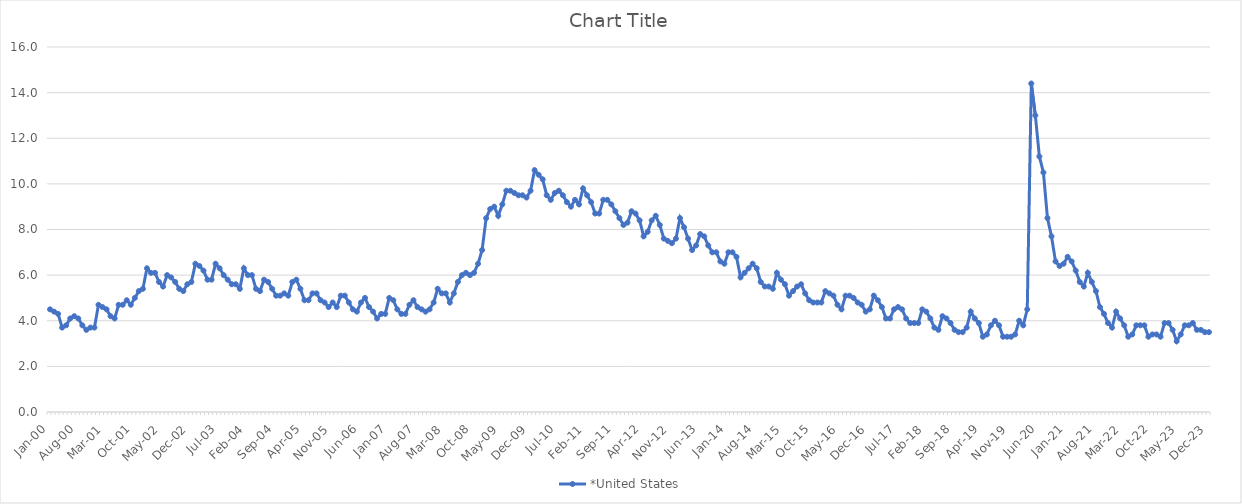
| Category | *United States | Alaska | Alabama | Arkansas | Arizona | California | Colorado | Connecticut | Delaware | Florida | Georgia | Hawaii | Iowa | Idaho | Illinois | Indiana | Kansas | Kentucky | Louisiana | Massachusetts | Maryland | Maine | Michigan | Minnesota | Missouri | Mississippi | Montana | North Carolina | North Dakota | Nebraska | New Hampshire | New Jersey | New Mexico | Nevada | New York | Ohio | Oklahoma | Oregon | Pennsylvania | Rhode Island | South Carolina | South Dakota | Tennessee | Texas | Utah | Virginia | Vermont | Washington | Wisconsin | West Virginia | Wyoming |
|---|---|---|---|---|---|---|---|---|---|---|---|---|---|---|---|---|---|---|---|---|---|---|---|---|---|---|---|---|---|---|---|---|---|---|---|---|---|---|---|---|---|---|---|---|---|---|---|---|---|---|---|
| Jan-00 | 4.5 |  |  |  |  |  |  |  |  |  |  |  |  |  |  |  |  |  |  |  |  |  |  |  |  |  |  |  |  |  |  |  |  |  |  |  |  |  |  |  |  |  |  |  |  |  |  |  |  |  |  |
| Feb-00 | 4.4 |  |  |  |  |  |  |  |  |  |  |  |  |  |  |  |  |  |  |  |  |  |  |  |  |  |  |  |  |  |  |  |  |  |  |  |  |  |  |  |  |  |  |  |  |  |  |  |  |  |  |
| Mar-00 | 4.3 |  |  |  |  |  |  |  |  |  |  |  |  |  |  |  |  |  |  |  |  |  |  |  |  |  |  |  |  |  |  |  |  |  |  |  |  |  |  |  |  |  |  |  |  |  |  |  |  |  |  |
| Apr-00 | 3.7 |  |  |  |  |  |  |  |  |  |  |  |  |  |  |  |  |  |  |  |  |  |  |  |  |  |  |  |  |  |  |  |  |  |  |  |  |  |  |  |  |  |  |  |  |  |  |  |  |  |  |
| May-00 | 3.8 |  |  |  |  |  |  |  |  |  |  |  |  |  |  |  |  |  |  |  |  |  |  |  |  |  |  |  |  |  |  |  |  |  |  |  |  |  |  |  |  |  |  |  |  |  |  |  |  |  |  |
| Jun-00 | 4.1 |  |  |  |  |  |  |  |  |  |  |  |  |  |  |  |  |  |  |  |  |  |  |  |  |  |  |  |  |  |  |  |  |  |  |  |  |  |  |  |  |  |  |  |  |  |  |  |  |  |  |
| Jul-00 | 4.2 |  |  |  |  |  |  |  |  |  |  |  |  |  |  |  |  |  |  |  |  |  |  |  |  |  |  |  |  |  |  |  |  |  |  |  |  |  |  |  |  |  |  |  |  |  |  |  |  |  |  |
| Aug-00 | 4.1 |  |  |  |  |  |  |  |  |  |  |  |  |  |  |  |  |  |  |  |  |  |  |  |  |  |  |  |  |  |  |  |  |  |  |  |  |  |  |  |  |  |  |  |  |  |  |  |  |  |  |
| Sep-00 | 3.8 |  |  |  |  |  |  |  |  |  |  |  |  |  |  |  |  |  |  |  |  |  |  |  |  |  |  |  |  |  |  |  |  |  |  |  |  |  |  |  |  |  |  |  |  |  |  |  |  |  |  |
| Oct-00 | 3.6 |  |  |  |  |  |  |  |  |  |  |  |  |  |  |  |  |  |  |  |  |  |  |  |  |  |  |  |  |  |  |  |  |  |  |  |  |  |  |  |  |  |  |  |  |  |  |  |  |  |  |
| Nov-00 | 3.7 |  |  |  |  |  |  |  |  |  |  |  |  |  |  |  |  |  |  |  |  |  |  |  |  |  |  |  |  |  |  |  |  |  |  |  |  |  |  |  |  |  |  |  |  |  |  |  |  |  |  |
| Dec-00 | 3.7 |  |  |  |  |  |  |  |  |  |  |  |  |  |  |  |  |  |  |  |  |  |  |  |  |  |  |  |  |  |  |  |  |  |  |  |  |  |  |  |  |  |  |  |  |  |  |  |  |  |  |
| Jan-01 | 4.7 |  |  |  |  |  |  |  |  |  |  |  |  |  |  |  |  |  |  |  |  |  |  |  |  |  |  |  |  |  |  |  |  |  |  |  |  |  |  |  |  |  |  |  |  |  |  |  |  |  |  |
| Feb-01 | 4.6 |  |  |  |  |  |  |  |  |  |  |  |  |  |  |  |  |  |  |  |  |  |  |  |  |  |  |  |  |  |  |  |  |  |  |  |  |  |  |  |  |  |  |  |  |  |  |  |  |  |  |
| Mar-01 | 4.5 |  |  |  |  |  |  |  |  |  |  |  |  |  |  |  |  |  |  |  |  |  |  |  |  |  |  |  |  |  |  |  |  |  |  |  |  |  |  |  |  |  |  |  |  |  |  |  |  |  |  |
| Apr-01 | 4.2 |  |  |  |  |  |  |  |  |  |  |  |  |  |  |  |  |  |  |  |  |  |  |  |  |  |  |  |  |  |  |  |  |  |  |  |  |  |  |  |  |  |  |  |  |  |  |  |  |  |  |
| May-01 | 4.1 |  |  |  |  |  |  |  |  |  |  |  |  |  |  |  |  |  |  |  |  |  |  |  |  |  |  |  |  |  |  |  |  |  |  |  |  |  |  |  |  |  |  |  |  |  |  |  |  |  |  |
| Jun-01 | 4.7 |  |  |  |  |  |  |  |  |  |  |  |  |  |  |  |  |  |  |  |  |  |  |  |  |  |  |  |  |  |  |  |  |  |  |  |  |  |  |  |  |  |  |  |  |  |  |  |  |  |  |
| Jul-01 | 4.7 |  |  |  |  |  |  |  |  |  |  |  |  |  |  |  |  |  |  |  |  |  |  |  |  |  |  |  |  |  |  |  |  |  |  |  |  |  |  |  |  |  |  |  |  |  |  |  |  |  |  |
| Aug-01 | 4.9 |  |  |  |  |  |  |  |  |  |  |  |  |  |  |  |  |  |  |  |  |  |  |  |  |  |  |  |  |  |  |  |  |  |  |  |  |  |  |  |  |  |  |  |  |  |  |  |  |  |  |
| Sep-01 | 4.7 |  |  |  |  |  |  |  |  |  |  |  |  |  |  |  |  |  |  |  |  |  |  |  |  |  |  |  |  |  |  |  |  |  |  |  |  |  |  |  |  |  |  |  |  |  |  |  |  |  |  |
| Oct-01 | 5 |  |  |  |  |  |  |  |  |  |  |  |  |  |  |  |  |  |  |  |  |  |  |  |  |  |  |  |  |  |  |  |  |  |  |  |  |  |  |  |  |  |  |  |  |  |  |  |  |  |  |
| Nov-01 | 5.3 |  |  |  |  |  |  |  |  |  |  |  |  |  |  |  |  |  |  |  |  |  |  |  |  |  |  |  |  |  |  |  |  |  |  |  |  |  |  |  |  |  |  |  |  |  |  |  |  |  |  |
| Dec-01 | 5.4 |  |  |  |  |  |  |  |  |  |  |  |  |  |  |  |  |  |  |  |  |  |  |  |  |  |  |  |  |  |  |  |  |  |  |  |  |  |  |  |  |  |  |  |  |  |  |  |  |  |  |
| Jan-02 | 6.3 |  |  |  |  |  |  |  |  |  |  |  |  |  |  |  |  |  |  |  |  |  |  |  |  |  |  |  |  |  |  |  |  |  |  |  |  |  |  |  |  |  |  |  |  |  |  |  |  |  |  |
| Feb-02 | 6.1 |  |  |  |  |  |  |  |  |  |  |  |  |  |  |  |  |  |  |  |  |  |  |  |  |  |  |  |  |  |  |  |  |  |  |  |  |  |  |  |  |  |  |  |  |  |  |  |  |  |  |
| Mar-02 | 6.1 |  |  |  |  |  |  |  |  |  |  |  |  |  |  |  |  |  |  |  |  |  |  |  |  |  |  |  |  |  |  |  |  |  |  |  |  |  |  |  |  |  |  |  |  |  |  |  |  |  |  |
| Apr-02 | 5.7 |  |  |  |  |  |  |  |  |  |  |  |  |  |  |  |  |  |  |  |  |  |  |  |  |  |  |  |  |  |  |  |  |  |  |  |  |  |  |  |  |  |  |  |  |  |  |  |  |  |  |
| May-02 | 5.5 |  |  |  |  |  |  |  |  |  |  |  |  |  |  |  |  |  |  |  |  |  |  |  |  |  |  |  |  |  |  |  |  |  |  |  |  |  |  |  |  |  |  |  |  |  |  |  |  |  |  |
| Jun-02 | 6 |  |  |  |  |  |  |  |  |  |  |  |  |  |  |  |  |  |  |  |  |  |  |  |  |  |  |  |  |  |  |  |  |  |  |  |  |  |  |  |  |  |  |  |  |  |  |  |  |  |  |
| Jul-02 | 5.9 |  |  |  |  |  |  |  |  |  |  |  |  |  |  |  |  |  |  |  |  |  |  |  |  |  |  |  |  |  |  |  |  |  |  |  |  |  |  |  |  |  |  |  |  |  |  |  |  |  |  |
| Aug-02 | 5.7 |  |  |  |  |  |  |  |  |  |  |  |  |  |  |  |  |  |  |  |  |  |  |  |  |  |  |  |  |  |  |  |  |  |  |  |  |  |  |  |  |  |  |  |  |  |  |  |  |  |  |
| Sep-02 | 5.4 |  |  |  |  |  |  |  |  |  |  |  |  |  |  |  |  |  |  |  |  |  |  |  |  |  |  |  |  |  |  |  |  |  |  |  |  |  |  |  |  |  |  |  |  |  |  |  |  |  |  |
| Oct-02 | 5.3 |  |  |  |  |  |  |  |  |  |  |  |  |  |  |  |  |  |  |  |  |  |  |  |  |  |  |  |  |  |  |  |  |  |  |  |  |  |  |  |  |  |  |  |  |  |  |  |  |  |  |
| Nov-02 | 5.6 |  |  |  |  |  |  |  |  |  |  |  |  |  |  |  |  |  |  |  |  |  |  |  |  |  |  |  |  |  |  |  |  |  |  |  |  |  |  |  |  |  |  |  |  |  |  |  |  |  |  |
| Dec-02 | 5.7 |  |  |  |  |  |  |  |  |  |  |  |  |  |  |  |  |  |  |  |  |  |  |  |  |  |  |  |  |  |  |  |  |  |  |  |  |  |  |  |  |  |  |  |  |  |  |  |  |  |  |
| Jan-03 | 6.5 |  |  |  |  |  |  |  |  |  |  |  |  |  |  |  |  |  |  |  |  |  |  |  |  |  |  |  |  |  |  |  |  |  |  |  |  |  |  |  |  |  |  |  |  |  |  |  |  |  |  |
| Feb-03 | 6.4 |  |  |  |  |  |  |  |  |  |  |  |  |  |  |  |  |  |  |  |  |  |  |  |  |  |  |  |  |  |  |  |  |  |  |  |  |  |  |  |  |  |  |  |  |  |  |  |  |  |  |
| Mar-03 | 6.2 |  |  |  |  |  |  |  |  |  |  |  |  |  |  |  |  |  |  |  |  |  |  |  |  |  |  |  |  |  |  |  |  |  |  |  |  |  |  |  |  |  |  |  |  |  |  |  |  |  |  |
| Apr-03 | 5.8 |  |  |  |  |  |  |  |  |  |  |  |  |  |  |  |  |  |  |  |  |  |  |  |  |  |  |  |  |  |  |  |  |  |  |  |  |  |  |  |  |  |  |  |  |  |  |  |  |  |  |
| May-03 | 5.8 |  |  |  |  |  |  |  |  |  |  |  |  |  |  |  |  |  |  |  |  |  |  |  |  |  |  |  |  |  |  |  |  |  |  |  |  |  |  |  |  |  |  |  |  |  |  |  |  |  |  |
| Jun-03 | 6.5 |  |  |  |  |  |  |  |  |  |  |  |  |  |  |  |  |  |  |  |  |  |  |  |  |  |  |  |  |  |  |  |  |  |  |  |  |  |  |  |  |  |  |  |  |  |  |  |  |  |  |
| Jul-03 | 6.3 |  |  |  |  |  |  |  |  |  |  |  |  |  |  |  |  |  |  |  |  |  |  |  |  |  |  |  |  |  |  |  |  |  |  |  |  |  |  |  |  |  |  |  |  |  |  |  |  |  |  |
| Aug-03 | 6 |  |  |  |  |  |  |  |  |  |  |  |  |  |  |  |  |  |  |  |  |  |  |  |  |  |  |  |  |  |  |  |  |  |  |  |  |  |  |  |  |  |  |  |  |  |  |  |  |  |  |
| Sep-03 | 5.8 |  |  |  |  |  |  |  |  |  |  |  |  |  |  |  |  |  |  |  |  |  |  |  |  |  |  |  |  |  |  |  |  |  |  |  |  |  |  |  |  |  |  |  |  |  |  |  |  |  |  |
| Oct-03 | 5.6 |  |  |  |  |  |  |  |  |  |  |  |  |  |  |  |  |  |  |  |  |  |  |  |  |  |  |  |  |  |  |  |  |  |  |  |  |  |  |  |  |  |  |  |  |  |  |  |  |  |  |
| Nov-03 | 5.6 |  |  |  |  |  |  |  |  |  |  |  |  |  |  |  |  |  |  |  |  |  |  |  |  |  |  |  |  |  |  |  |  |  |  |  |  |  |  |  |  |  |  |  |  |  |  |  |  |  |  |
| Dec-03 | 5.4 |  |  |  |  |  |  |  |  |  |  |  |  |  |  |  |  |  |  |  |  |  |  |  |  |  |  |  |  |  |  |  |  |  |  |  |  |  |  |  |  |  |  |  |  |  |  |  |  |  |  |
| Jan-04 | 6.3 |  |  |  |  |  |  |  |  |  |  |  |  |  |  |  |  |  |  |  |  |  |  |  |  |  |  |  |  |  |  |  |  |  |  |  |  |  |  |  |  |  |  |  |  |  |  |  |  |  |  |
| Feb-04 | 6 |  |  |  |  |  |  |  |  |  |  |  |  |  |  |  |  |  |  |  |  |  |  |  |  |  |  |  |  |  |  |  |  |  |  |  |  |  |  |  |  |  |  |  |  |  |  |  |  |  |  |
| Mar-04 | 6 |  |  |  |  |  |  |  |  |  |  |  |  |  |  |  |  |  |  |  |  |  |  |  |  |  |  |  |  |  |  |  |  |  |  |  |  |  |  |  |  |  |  |  |  |  |  |  |  |  |  |
| Apr-04 | 5.4 |  |  |  |  |  |  |  |  |  |  |  |  |  |  |  |  |  |  |  |  |  |  |  |  |  |  |  |  |  |  |  |  |  |  |  |  |  |  |  |  |  |  |  |  |  |  |  |  |  |  |
| May-04 | 5.3 |  |  |  |  |  |  |  |  |  |  |  |  |  |  |  |  |  |  |  |  |  |  |  |  |  |  |  |  |  |  |  |  |  |  |  |  |  |  |  |  |  |  |  |  |  |  |  |  |  |  |
| Jun-04 | 5.8 |  |  |  |  |  |  |  |  |  |  |  |  |  |  |  |  |  |  |  |  |  |  |  |  |  |  |  |  |  |  |  |  |  |  |  |  |  |  |  |  |  |  |  |  |  |  |  |  |  |  |
| Jul-04 | 5.7 |  |  |  |  |  |  |  |  |  |  |  |  |  |  |  |  |  |  |  |  |  |  |  |  |  |  |  |  |  |  |  |  |  |  |  |  |  |  |  |  |  |  |  |  |  |  |  |  |  |  |
| Aug-04 | 5.4 |  |  |  |  |  |  |  |  |  |  |  |  |  |  |  |  |  |  |  |  |  |  |  |  |  |  |  |  |  |  |  |  |  |  |  |  |  |  |  |  |  |  |  |  |  |  |  |  |  |  |
| Sep-04 | 5.1 |  |  |  |  |  |  |  |  |  |  |  |  |  |  |  |  |  |  |  |  |  |  |  |  |  |  |  |  |  |  |  |  |  |  |  |  |  |  |  |  |  |  |  |  |  |  |  |  |  |  |
| Oct-04 | 5.1 |  |  |  |  |  |  |  |  |  |  |  |  |  |  |  |  |  |  |  |  |  |  |  |  |  |  |  |  |  |  |  |  |  |  |  |  |  |  |  |  |  |  |  |  |  |  |  |  |  |  |
| Nov-04 | 5.2 |  |  |  |  |  |  |  |  |  |  |  |  |  |  |  |  |  |  |  |  |  |  |  |  |  |  |  |  |  |  |  |  |  |  |  |  |  |  |  |  |  |  |  |  |  |  |  |  |  |  |
| Dec-04 | 5.1 |  |  |  |  |  |  |  |  |  |  |  |  |  |  |  |  |  |  |  |  |  |  |  |  |  |  |  |  |  |  |  |  |  |  |  |  |  |  |  |  |  |  |  |  |  |  |  |  |  |  |
| Jan-05 | 5.7 |  |  |  |  |  |  |  |  |  |  |  |  |  |  |  |  |  |  |  |  |  |  |  |  |  |  |  |  |  |  |  |  |  |  |  |  |  |  |  |  |  |  |  |  |  |  |  |  |  |  |
| Feb-05 | 5.8 |  |  |  |  |  |  |  |  |  |  |  |  |  |  |  |  |  |  |  |  |  |  |  |  |  |  |  |  |  |  |  |  |  |  |  |  |  |  |  |  |  |  |  |  |  |  |  |  |  |  |
| Mar-05 | 5.4 |  |  |  |  |  |  |  |  |  |  |  |  |  |  |  |  |  |  |  |  |  |  |  |  |  |  |  |  |  |  |  |  |  |  |  |  |  |  |  |  |  |  |  |  |  |  |  |  |  |  |
| Apr-05 | 4.9 |  |  |  |  |  |  |  |  |  |  |  |  |  |  |  |  |  |  |  |  |  |  |  |  |  |  |  |  |  |  |  |  |  |  |  |  |  |  |  |  |  |  |  |  |  |  |  |  |  |  |
| May-05 | 4.9 |  |  |  |  |  |  |  |  |  |  |  |  |  |  |  |  |  |  |  |  |  |  |  |  |  |  |  |  |  |  |  |  |  |  |  |  |  |  |  |  |  |  |  |  |  |  |  |  |  |  |
| Jun-05 | 5.2 |  |  |  |  |  |  |  |  |  |  |  |  |  |  |  |  |  |  |  |  |  |  |  |  |  |  |  |  |  |  |  |  |  |  |  |  |  |  |  |  |  |  |  |  |  |  |  |  |  |  |
| Jul-05 | 5.2 |  |  |  |  |  |  |  |  |  |  |  |  |  |  |  |  |  |  |  |  |  |  |  |  |  |  |  |  |  |  |  |  |  |  |  |  |  |  |  |  |  |  |  |  |  |  |  |  |  |  |
| Aug-05 | 4.9 |  |  |  |  |  |  |  |  |  |  |  |  |  |  |  |  |  |  |  |  |  |  |  |  |  |  |  |  |  |  |  |  |  |  |  |  |  |  |  |  |  |  |  |  |  |  |  |  |  |  |
| Sep-05 | 4.8 |  |  |  |  |  |  |  |  |  |  |  |  |  |  |  |  |  |  |  |  |  |  |  |  |  |  |  |  |  |  |  |  |  |  |  |  |  |  |  |  |  |  |  |  |  |  |  |  |  |  |
| Oct-05 | 4.6 |  |  |  |  |  |  |  |  |  |  |  |  |  |  |  |  |  |  |  |  |  |  |  |  |  |  |  |  |  |  |  |  |  |  |  |  |  |  |  |  |  |  |  |  |  |  |  |  |  |  |
| Nov-05 | 4.8 |  |  |  |  |  |  |  |  |  |  |  |  |  |  |  |  |  |  |  |  |  |  |  |  |  |  |  |  |  |  |  |  |  |  |  |  |  |  |  |  |  |  |  |  |  |  |  |  |  |  |
| Dec-05 | 4.6 |  |  |  |  |  |  |  |  |  |  |  |  |  |  |  |  |  |  |  |  |  |  |  |  |  |  |  |  |  |  |  |  |  |  |  |  |  |  |  |  |  |  |  |  |  |  |  |  |  |  |
| Jan-06 | 5.1 |  |  |  |  |  |  |  |  |  |  |  |  |  |  |  |  |  |  |  |  |  |  |  |  |  |  |  |  |  |  |  |  |  |  |  |  |  |  |  |  |  |  |  |  |  |  |  |  |  |  |
| Feb-06 | 5.1 |  |  |  |  |  |  |  |  |  |  |  |  |  |  |  |  |  |  |  |  |  |  |  |  |  |  |  |  |  |  |  |  |  |  |  |  |  |  |  |  |  |  |  |  |  |  |  |  |  |  |
| Mar-06 | 4.8 |  |  |  |  |  |  |  |  |  |  |  |  |  |  |  |  |  |  |  |  |  |  |  |  |  |  |  |  |  |  |  |  |  |  |  |  |  |  |  |  |  |  |  |  |  |  |  |  |  |  |
| Apr-06 | 4.5 |  |  |  |  |  |  |  |  |  |  |  |  |  |  |  |  |  |  |  |  |  |  |  |  |  |  |  |  |  |  |  |  |  |  |  |  |  |  |  |  |  |  |  |  |  |  |  |  |  |  |
| May-06 | 4.4 |  |  |  |  |  |  |  |  |  |  |  |  |  |  |  |  |  |  |  |  |  |  |  |  |  |  |  |  |  |  |  |  |  |  |  |  |  |  |  |  |  |  |  |  |  |  |  |  |  |  |
| Jun-06 | 4.8 |  |  |  |  |  |  |  |  |  |  |  |  |  |  |  |  |  |  |  |  |  |  |  |  |  |  |  |  |  |  |  |  |  |  |  |  |  |  |  |  |  |  |  |  |  |  |  |  |  |  |
| Jul-06 | 5 |  |  |  |  |  |  |  |  |  |  |  |  |  |  |  |  |  |  |  |  |  |  |  |  |  |  |  |  |  |  |  |  |  |  |  |  |  |  |  |  |  |  |  |  |  |  |  |  |  |  |
| Aug-06 | 4.6 |  |  |  |  |  |  |  |  |  |  |  |  |  |  |  |  |  |  |  |  |  |  |  |  |  |  |  |  |  |  |  |  |  |  |  |  |  |  |  |  |  |  |  |  |  |  |  |  |  |  |
| Sep-06 | 4.4 |  |  |  |  |  |  |  |  |  |  |  |  |  |  |  |  |  |  |  |  |  |  |  |  |  |  |  |  |  |  |  |  |  |  |  |  |  |  |  |  |  |  |  |  |  |  |  |  |  |  |
| Oct-06 | 4.1 |  |  |  |  |  |  |  |  |  |  |  |  |  |  |  |  |  |  |  |  |  |  |  |  |  |  |  |  |  |  |  |  |  |  |  |  |  |  |  |  |  |  |  |  |  |  |  |  |  |  |
| Nov-06 | 4.3 |  |  |  |  |  |  |  |  |  |  |  |  |  |  |  |  |  |  |  |  |  |  |  |  |  |  |  |  |  |  |  |  |  |  |  |  |  |  |  |  |  |  |  |  |  |  |  |  |  |  |
| Dec-06 | 4.3 |  |  |  |  |  |  |  |  |  |  |  |  |  |  |  |  |  |  |  |  |  |  |  |  |  |  |  |  |  |  |  |  |  |  |  |  |  |  |  |  |  |  |  |  |  |  |  |  |  |  |
| Jan-07 | 5 |  |  |  |  |  |  |  |  |  |  |  |  |  |  |  |  |  |  |  |  |  |  |  |  |  |  |  |  |  |  |  |  |  |  |  |  |  |  |  |  |  |  |  |  |  |  |  |  |  |  |
| Feb-07 | 4.9 |  |  |  |  |  |  |  |  |  |  |  |  |  |  |  |  |  |  |  |  |  |  |  |  |  |  |  |  |  |  |  |  |  |  |  |  |  |  |  |  |  |  |  |  |  |  |  |  |  |  |
| Mar-07 | 4.5 |  |  |  |  |  |  |  |  |  |  |  |  |  |  |  |  |  |  |  |  |  |  |  |  |  |  |  |  |  |  |  |  |  |  |  |  |  |  |  |  |  |  |  |  |  |  |  |  |  |  |
| Apr-07 | 4.3 |  |  |  |  |  |  |  |  |  |  |  |  |  |  |  |  |  |  |  |  |  |  |  |  |  |  |  |  |  |  |  |  |  |  |  |  |  |  |  |  |  |  |  |  |  |  |  |  |  |  |
| May-07 | 4.3 |  |  |  |  |  |  |  |  |  |  |  |  |  |  |  |  |  |  |  |  |  |  |  |  |  |  |  |  |  |  |  |  |  |  |  |  |  |  |  |  |  |  |  |  |  |  |  |  |  |  |
| Jun-07 | 4.7 |  |  |  |  |  |  |  |  |  |  |  |  |  |  |  |  |  |  |  |  |  |  |  |  |  |  |  |  |  |  |  |  |  |  |  |  |  |  |  |  |  |  |  |  |  |  |  |  |  |  |
| Jul-07 | 4.9 |  |  |  |  |  |  |  |  |  |  |  |  |  |  |  |  |  |  |  |  |  |  |  |  |  |  |  |  |  |  |  |  |  |  |  |  |  |  |  |  |  |  |  |  |  |  |  |  |  |  |
| Aug-07 | 4.6 |  |  |  |  |  |  |  |  |  |  |  |  |  |  |  |  |  |  |  |  |  |  |  |  |  |  |  |  |  |  |  |  |  |  |  |  |  |  |  |  |  |  |  |  |  |  |  |  |  |  |
| Sep-07 | 4.5 |  |  |  |  |  |  |  |  |  |  |  |  |  |  |  |  |  |  |  |  |  |  |  |  |  |  |  |  |  |  |  |  |  |  |  |  |  |  |  |  |  |  |  |  |  |  |  |  |  |  |
| Oct-07 | 4.4 |  |  |  |  |  |  |  |  |  |  |  |  |  |  |  |  |  |  |  |  |  |  |  |  |  |  |  |  |  |  |  |  |  |  |  |  |  |  |  |  |  |  |  |  |  |  |  |  |  |  |
| Nov-07 | 4.5 |  |  |  |  |  |  |  |  |  |  |  |  |  |  |  |  |  |  |  |  |  |  |  |  |  |  |  |  |  |  |  |  |  |  |  |  |  |  |  |  |  |  |  |  |  |  |  |  |  |  |
| Dec-07 | 4.8 |  |  |  |  |  |  |  |  |  |  |  |  |  |  |  |  |  |  |  |  |  |  |  |  |  |  |  |  |  |  |  |  |  |  |  |  |  |  |  |  |  |  |  |  |  |  |  |  |  |  |
| Jan-08 | 5.4 |  |  |  |  |  |  |  |  |  |  |  |  |  |  |  |  |  |  |  |  |  |  |  |  |  |  |  |  |  |  |  |  |  |  |  |  |  |  |  |  |  |  |  |  |  |  |  |  |  |  |
| Feb-08 | 5.2 |  |  |  |  |  |  |  |  |  |  |  |  |  |  |  |  |  |  |  |  |  |  |  |  |  |  |  |  |  |  |  |  |  |  |  |  |  |  |  |  |  |  |  |  |  |  |  |  |  |  |
| Mar-08 | 5.2 |  |  |  |  |  |  |  |  |  |  |  |  |  |  |  |  |  |  |  |  |  |  |  |  |  |  |  |  |  |  |  |  |  |  |  |  |  |  |  |  |  |  |  |  |  |  |  |  |  |  |
| Apr-08 | 4.8 |  |  |  |  |  |  |  |  |  |  |  |  |  |  |  |  |  |  |  |  |  |  |  |  |  |  |  |  |  |  |  |  |  |  |  |  |  |  |  |  |  |  |  |  |  |  |  |  |  |  |
| May-08 | 5.2 |  |  |  |  |  |  |  |  |  |  |  |  |  |  |  |  |  |  |  |  |  |  |  |  |  |  |  |  |  |  |  |  |  |  |  |  |  |  |  |  |  |  |  |  |  |  |  |  |  |  |
| Jun-08 | 5.7 |  |  |  |  |  |  |  |  |  |  |  |  |  |  |  |  |  |  |  |  |  |  |  |  |  |  |  |  |  |  |  |  |  |  |  |  |  |  |  |  |  |  |  |  |  |  |  |  |  |  |
| Jul-08 | 6 |  |  |  |  |  |  |  |  |  |  |  |  |  |  |  |  |  |  |  |  |  |  |  |  |  |  |  |  |  |  |  |  |  |  |  |  |  |  |  |  |  |  |  |  |  |  |  |  |  |  |
| Aug-08 | 6.1 |  |  |  |  |  |  |  |  |  |  |  |  |  |  |  |  |  |  |  |  |  |  |  |  |  |  |  |  |  |  |  |  |  |  |  |  |  |  |  |  |  |  |  |  |  |  |  |  |  |  |
| Sep-08 | 6 |  |  |  |  |  |  |  |  |  |  |  |  |  |  |  |  |  |  |  |  |  |  |  |  |  |  |  |  |  |  |  |  |  |  |  |  |  |  |  |  |  |  |  |  |  |  |  |  |  |  |
| Oct-08 | 6.1 |  |  |  |  |  |  |  |  |  |  |  |  |  |  |  |  |  |  |  |  |  |  |  |  |  |  |  |  |  |  |  |  |  |  |  |  |  |  |  |  |  |  |  |  |  |  |  |  |  |  |
| Nov-08 | 6.5 |  |  |  |  |  |  |  |  |  |  |  |  |  |  |  |  |  |  |  |  |  |  |  |  |  |  |  |  |  |  |  |  |  |  |  |  |  |  |  |  |  |  |  |  |  |  |  |  |  |  |
| Dec-08 | 7.1 |  |  |  |  |  |  |  |  |  |  |  |  |  |  |  |  |  |  |  |  |  |  |  |  |  |  |  |  |  |  |  |  |  |  |  |  |  |  |  |  |  |  |  |  |  |  |  |  |  |  |
| Jan-09 | 8.5 |  |  |  |  |  |  |  |  |  |  |  |  |  |  |  |  |  |  |  |  |  |  |  |  |  |  |  |  |  |  |  |  |  |  |  |  |  |  |  |  |  |  |  |  |  |  |  |  |  |  |
| Feb-09 | 8.9 |  |  |  |  |  |  |  |  |  |  |  |  |  |  |  |  |  |  |  |  |  |  |  |  |  |  |  |  |  |  |  |  |  |  |  |  |  |  |  |  |  |  |  |  |  |  |  |  |  |  |
| Mar-09 | 9 |  |  |  |  |  |  |  |  |  |  |  |  |  |  |  |  |  |  |  |  |  |  |  |  |  |  |  |  |  |  |  |  |  |  |  |  |  |  |  |  |  |  |  |  |  |  |  |  |  |  |
| Apr-09 | 8.6 |  |  |  |  |  |  |  |  |  |  |  |  |  |  |  |  |  |  |  |  |  |  |  |  |  |  |  |  |  |  |  |  |  |  |  |  |  |  |  |  |  |  |  |  |  |  |  |  |  |  |
| May-09 | 9.1 |  |  |  |  |  |  |  |  |  |  |  |  |  |  |  |  |  |  |  |  |  |  |  |  |  |  |  |  |  |  |  |  |  |  |  |  |  |  |  |  |  |  |  |  |  |  |  |  |  |  |
| Jun-09 | 9.7 |  |  |  |  |  |  |  |  |  |  |  |  |  |  |  |  |  |  |  |  |  |  |  |  |  |  |  |  |  |  |  |  |  |  |  |  |  |  |  |  |  |  |  |  |  |  |  |  |  |  |
| Jul-09 | 9.7 |  |  |  |  |  |  |  |  |  |  |  |  |  |  |  |  |  |  |  |  |  |  |  |  |  |  |  |  |  |  |  |  |  |  |  |  |  |  |  |  |  |  |  |  |  |  |  |  |  |  |
| Aug-09 | 9.6 |  |  |  |  |  |  |  |  |  |  |  |  |  |  |  |  |  |  |  |  |  |  |  |  |  |  |  |  |  |  |  |  |  |  |  |  |  |  |  |  |  |  |  |  |  |  |  |  |  |  |
| Sep-09 | 9.5 |  |  |  |  |  |  |  |  |  |  |  |  |  |  |  |  |  |  |  |  |  |  |  |  |  |  |  |  |  |  |  |  |  |  |  |  |  |  |  |  |  |  |  |  |  |  |  |  |  |  |
| Oct-09 | 9.5 |  |  |  |  |  |  |  |  |  |  |  |  |  |  |  |  |  |  |  |  |  |  |  |  |  |  |  |  |  |  |  |  |  |  |  |  |  |  |  |  |  |  |  |  |  |  |  |  |  |  |
| Nov-09 | 9.4 |  |  |  |  |  |  |  |  |  |  |  |  |  |  |  |  |  |  |  |  |  |  |  |  |  |  |  |  |  |  |  |  |  |  |  |  |  |  |  |  |  |  |  |  |  |  |  |  |  |  |
| Dec-09 | 9.7 |  |  |  |  |  |  |  |  |  |  |  |  |  |  |  |  |  |  |  |  |  |  |  |  |  |  |  |  |  |  |  |  |  |  |  |  |  |  |  |  |  |  |  |  |  |  |  |  |  |  |
| Jan-10 | 10.6 |  |  |  |  |  |  |  |  |  |  |  |  |  |  |  |  |  |  |  |  |  |  |  |  |  |  |  |  |  |  |  |  |  |  |  |  |  |  |  |  |  |  |  |  |  |  |  |  |  |  |
| Feb-10 | 10.4 |  |  |  |  |  |  |  |  |  |  |  |  |  |  |  |  |  |  |  |  |  |  |  |  |  |  |  |  |  |  |  |  |  |  |  |  |  |  |  |  |  |  |  |  |  |  |  |  |  |  |
| Mar-10 | 10.2 |  |  |  |  |  |  |  |  |  |  |  |  |  |  |  |  |  |  |  |  |  |  |  |  |  |  |  |  |  |  |  |  |  |  |  |  |  |  |  |  |  |  |  |  |  |  |  |  |  |  |
| Apr-10 | 9.5 |  |  |  |  |  |  |  |  |  |  |  |  |  |  |  |  |  |  |  |  |  |  |  |  |  |  |  |  |  |  |  |  |  |  |  |  |  |  |  |  |  |  |  |  |  |  |  |  |  |  |
| May-10 | 9.3 |  |  |  |  |  |  |  |  |  |  |  |  |  |  |  |  |  |  |  |  |  |  |  |  |  |  |  |  |  |  |  |  |  |  |  |  |  |  |  |  |  |  |  |  |  |  |  |  |  |  |
| Jun-10 | 9.6 |  |  |  |  |  |  |  |  |  |  |  |  |  |  |  |  |  |  |  |  |  |  |  |  |  |  |  |  |  |  |  |  |  |  |  |  |  |  |  |  |  |  |  |  |  |  |  |  |  |  |
| Jul-10 | 9.7 |  |  |  |  |  |  |  |  |  |  |  |  |  |  |  |  |  |  |  |  |  |  |  |  |  |  |  |  |  |  |  |  |  |  |  |  |  |  |  |  |  |  |  |  |  |  |  |  |  |  |
| Aug-10 | 9.5 |  |  |  |  |  |  |  |  |  |  |  |  |  |  |  |  |  |  |  |  |  |  |  |  |  |  |  |  |  |  |  |  |  |  |  |  |  |  |  |  |  |  |  |  |  |  |  |  |  |  |
| Sep-10 | 9.2 |  |  |  |  |  |  |  |  |  |  |  |  |  |  |  |  |  |  |  |  |  |  |  |  |  |  |  |  |  |  |  |  |  |  |  |  |  |  |  |  |  |  |  |  |  |  |  |  |  |  |
| Oct-10 | 9 |  |  |  |  |  |  |  |  |  |  |  |  |  |  |  |  |  |  |  |  |  |  |  |  |  |  |  |  |  |  |  |  |  |  |  |  |  |  |  |  |  |  |  |  |  |  |  |  |  |  |
| Nov-10 | 9.3 |  |  |  |  |  |  |  |  |  |  |  |  |  |  |  |  |  |  |  |  |  |  |  |  |  |  |  |  |  |  |  |  |  |  |  |  |  |  |  |  |  |  |  |  |  |  |  |  |  |  |
| Dec-10 | 9.1 |  |  |  |  |  |  |  |  |  |  |  |  |  |  |  |  |  |  |  |  |  |  |  |  |  |  |  |  |  |  |  |  |  |  |  |  |  |  |  |  |  |  |  |  |  |  |  |  |  |  |
| Jan-11 | 9.8 |  |  |  |  |  |  |  |  |  |  |  |  |  |  |  |  |  |  |  |  |  |  |  |  |  |  |  |  |  |  |  |  |  |  |  |  |  |  |  |  |  |  |  |  |  |  |  |  |  |  |
| Feb-11 | 9.5 |  |  |  |  |  |  |  |  |  |  |  |  |  |  |  |  |  |  |  |  |  |  |  |  |  |  |  |  |  |  |  |  |  |  |  |  |  |  |  |  |  |  |  |  |  |  |  |  |  |  |
| Mar-11 | 9.2 |  |  |  |  |  |  |  |  |  |  |  |  |  |  |  |  |  |  |  |  |  |  |  |  |  |  |  |  |  |  |  |  |  |  |  |  |  |  |  |  |  |  |  |  |  |  |  |  |  |  |
| Apr-11 | 8.7 |  |  |  |  |  |  |  |  |  |  |  |  |  |  |  |  |  |  |  |  |  |  |  |  |  |  |  |  |  |  |  |  |  |  |  |  |  |  |  |  |  |  |  |  |  |  |  |  |  |  |
| May-11 | 8.7 |  |  |  |  |  |  |  |  |  |  |  |  |  |  |  |  |  |  |  |  |  |  |  |  |  |  |  |  |  |  |  |  |  |  |  |  |  |  |  |  |  |  |  |  |  |  |  |  |  |  |
| Jun-11 | 9.3 |  |  |  |  |  |  |  |  |  |  |  |  |  |  |  |  |  |  |  |  |  |  |  |  |  |  |  |  |  |  |  |  |  |  |  |  |  |  |  |  |  |  |  |  |  |  |  |  |  |  |
| Jul-11 | 9.3 |  |  |  |  |  |  |  |  |  |  |  |  |  |  |  |  |  |  |  |  |  |  |  |  |  |  |  |  |  |  |  |  |  |  |  |  |  |  |  |  |  |  |  |  |  |  |  |  |  |  |
| Aug-11 | 9.1 |  |  |  |  |  |  |  |  |  |  |  |  |  |  |  |  |  |  |  |  |  |  |  |  |  |  |  |  |  |  |  |  |  |  |  |  |  |  |  |  |  |  |  |  |  |  |  |  |  |  |
| Sep-11 | 8.8 |  |  |  |  |  |  |  |  |  |  |  |  |  |  |  |  |  |  |  |  |  |  |  |  |  |  |  |  |  |  |  |  |  |  |  |  |  |  |  |  |  |  |  |  |  |  |  |  |  |  |
| Oct-11 | 8.5 |  |  |  |  |  |  |  |  |  |  |  |  |  |  |  |  |  |  |  |  |  |  |  |  |  |  |  |  |  |  |  |  |  |  |  |  |  |  |  |  |  |  |  |  |  |  |  |  |  |  |
| Nov-11 | 8.2 |  |  |  |  |  |  |  |  |  |  |  |  |  |  |  |  |  |  |  |  |  |  |  |  |  |  |  |  |  |  |  |  |  |  |  |  |  |  |  |  |  |  |  |  |  |  |  |  |  |  |
| Dec-11 | 8.3 |  |  |  |  |  |  |  |  |  |  |  |  |  |  |  |  |  |  |  |  |  |  |  |  |  |  |  |  |  |  |  |  |  |  |  |  |  |  |  |  |  |  |  |  |  |  |  |  |  |  |
| Jan-12 | 8.8 |  |  |  |  |  |  |  |  |  |  |  |  |  |  |  |  |  |  |  |  |  |  |  |  |  |  |  |  |  |  |  |  |  |  |  |  |  |  |  |  |  |  |  |  |  |  |  |  |  |  |
| Feb-12 | 8.7 |  |  |  |  |  |  |  |  |  |  |  |  |  |  |  |  |  |  |  |  |  |  |  |  |  |  |  |  |  |  |  |  |  |  |  |  |  |  |  |  |  |  |  |  |  |  |  |  |  |  |
| Mar-12 | 8.4 |  |  |  |  |  |  |  |  |  |  |  |  |  |  |  |  |  |  |  |  |  |  |  |  |  |  |  |  |  |  |  |  |  |  |  |  |  |  |  |  |  |  |  |  |  |  |  |  |  |  |
| Apr-12 | 7.7 |  |  |  |  |  |  |  |  |  |  |  |  |  |  |  |  |  |  |  |  |  |  |  |  |  |  |  |  |  |  |  |  |  |  |  |  |  |  |  |  |  |  |  |  |  |  |  |  |  |  |
| May-12 | 7.9 |  |  |  |  |  |  |  |  |  |  |  |  |  |  |  |  |  |  |  |  |  |  |  |  |  |  |  |  |  |  |  |  |  |  |  |  |  |  |  |  |  |  |  |  |  |  |  |  |  |  |
| Jun-12 | 8.4 |  |  |  |  |  |  |  |  |  |  |  |  |  |  |  |  |  |  |  |  |  |  |  |  |  |  |  |  |  |  |  |  |  |  |  |  |  |  |  |  |  |  |  |  |  |  |  |  |  |  |
| Jul-12 | 8.6 |  |  |  |  |  |  |  |  |  |  |  |  |  |  |  |  |  |  |  |  |  |  |  |  |  |  |  |  |  |  |  |  |  |  |  |  |  |  |  |  |  |  |  |  |  |  |  |  |  |  |
| Aug-12 | 8.2 |  |  |  |  |  |  |  |  |  |  |  |  |  |  |  |  |  |  |  |  |  |  |  |  |  |  |  |  |  |  |  |  |  |  |  |  |  |  |  |  |  |  |  |  |  |  |  |  |  |  |
| Sep-12 | 7.6 |  |  |  |  |  |  |  |  |  |  |  |  |  |  |  |  |  |  |  |  |  |  |  |  |  |  |  |  |  |  |  |  |  |  |  |  |  |  |  |  |  |  |  |  |  |  |  |  |  |  |
| Oct-12 | 7.5 |  |  |  |  |  |  |  |  |  |  |  |  |  |  |  |  |  |  |  |  |  |  |  |  |  |  |  |  |  |  |  |  |  |  |  |  |  |  |  |  |  |  |  |  |  |  |  |  |  |  |
| Nov-12 | 7.4 |  |  |  |  |  |  |  |  |  |  |  |  |  |  |  |  |  |  |  |  |  |  |  |  |  |  |  |  |  |  |  |  |  |  |  |  |  |  |  |  |  |  |  |  |  |  |  |  |  |  |
| Dec-12 | 7.6 |  |  |  |  |  |  |  |  |  |  |  |  |  |  |  |  |  |  |  |  |  |  |  |  |  |  |  |  |  |  |  |  |  |  |  |  |  |  |  |  |  |  |  |  |  |  |  |  |  |  |
| Jan-13 | 8.5 |  |  |  |  |  |  |  |  |  |  |  |  |  |  |  |  |  |  |  |  |  |  |  |  |  |  |  |  |  |  |  |  |  |  |  |  |  |  |  |  |  |  |  |  |  |  |  |  |  |  |
| Feb-13 | 8.1 |  |  |  |  |  |  |  |  |  |  |  |  |  |  |  |  |  |  |  |  |  |  |  |  |  |  |  |  |  |  |  |  |  |  |  |  |  |  |  |  |  |  |  |  |  |  |  |  |  |  |
| Mar-13 | 7.6 |  |  |  |  |  |  |  |  |  |  |  |  |  |  |  |  |  |  |  |  |  |  |  |  |  |  |  |  |  |  |  |  |  |  |  |  |  |  |  |  |  |  |  |  |  |  |  |  |  |  |
| Apr-13 | 7.1 |  |  |  |  |  |  |  |  |  |  |  |  |  |  |  |  |  |  |  |  |  |  |  |  |  |  |  |  |  |  |  |  |  |  |  |  |  |  |  |  |  |  |  |  |  |  |  |  |  |  |
| May-13 | 7.3 |  |  |  |  |  |  |  |  |  |  |  |  |  |  |  |  |  |  |  |  |  |  |  |  |  |  |  |  |  |  |  |  |  |  |  |  |  |  |  |  |  |  |  |  |  |  |  |  |  |  |
| Jun-13 | 7.8 |  |  |  |  |  |  |  |  |  |  |  |  |  |  |  |  |  |  |  |  |  |  |  |  |  |  |  |  |  |  |  |  |  |  |  |  |  |  |  |  |  |  |  |  |  |  |  |  |  |  |
| Jul-13 | 7.7 |  |  |  |  |  |  |  |  |  |  |  |  |  |  |  |  |  |  |  |  |  |  |  |  |  |  |  |  |  |  |  |  |  |  |  |  |  |  |  |  |  |  |  |  |  |  |  |  |  |  |
| Aug-13 | 7.3 |  |  |  |  |  |  |  |  |  |  |  |  |  |  |  |  |  |  |  |  |  |  |  |  |  |  |  |  |  |  |  |  |  |  |  |  |  |  |  |  |  |  |  |  |  |  |  |  |  |  |
| Sep-13 | 7 |  |  |  |  |  |  |  |  |  |  |  |  |  |  |  |  |  |  |  |  |  |  |  |  |  |  |  |  |  |  |  |  |  |  |  |  |  |  |  |  |  |  |  |  |  |  |  |  |  |  |
| Oct-13 | 7 |  |  |  |  |  |  |  |  |  |  |  |  |  |  |  |  |  |  |  |  |  |  |  |  |  |  |  |  |  |  |  |  |  |  |  |  |  |  |  |  |  |  |  |  |  |  |  |  |  |  |
| Nov-13 | 6.6 |  |  |  |  |  |  |  |  |  |  |  |  |  |  |  |  |  |  |  |  |  |  |  |  |  |  |  |  |  |  |  |  |  |  |  |  |  |  |  |  |  |  |  |  |  |  |  |  |  |  |
| Dec-13 | 6.5 |  |  |  |  |  |  |  |  |  |  |  |  |  |  |  |  |  |  |  |  |  |  |  |  |  |  |  |  |  |  |  |  |  |  |  |  |  |  |  |  |  |  |  |  |  |  |  |  |  |  |
| Jan-14 | 7 |  |  |  |  |  |  |  |  |  |  |  |  |  |  |  |  |  |  |  |  |  |  |  |  |  |  |  |  |  |  |  |  |  |  |  |  |  |  |  |  |  |  |  |  |  |  |  |  |  |  |
| Feb-14 | 7 |  |  |  |  |  |  |  |  |  |  |  |  |  |  |  |  |  |  |  |  |  |  |  |  |  |  |  |  |  |  |  |  |  |  |  |  |  |  |  |  |  |  |  |  |  |  |  |  |  |  |
| Mar-14 | 6.8 |  |  |  |  |  |  |  |  |  |  |  |  |  |  |  |  |  |  |  |  |  |  |  |  |  |  |  |  |  |  |  |  |  |  |  |  |  |  |  |  |  |  |  |  |  |  |  |  |  |  |
| Apr-14 | 5.9 |  |  |  |  |  |  |  |  |  |  |  |  |  |  |  |  |  |  |  |  |  |  |  |  |  |  |  |  |  |  |  |  |  |  |  |  |  |  |  |  |  |  |  |  |  |  |  |  |  |  |
| May-14 | 6.1 |  |  |  |  |  |  |  |  |  |  |  |  |  |  |  |  |  |  |  |  |  |  |  |  |  |  |  |  |  |  |  |  |  |  |  |  |  |  |  |  |  |  |  |  |  |  |  |  |  |  |
| Jun-14 | 6.3 |  |  |  |  |  |  |  |  |  |  |  |  |  |  |  |  |  |  |  |  |  |  |  |  |  |  |  |  |  |  |  |  |  |  |  |  |  |  |  |  |  |  |  |  |  |  |  |  |  |  |
| Jul-14 | 6.5 |  |  |  |  |  |  |  |  |  |  |  |  |  |  |  |  |  |  |  |  |  |  |  |  |  |  |  |  |  |  |  |  |  |  |  |  |  |  |  |  |  |  |  |  |  |  |  |  |  |  |
| Aug-14 | 6.3 |  |  |  |  |  |  |  |  |  |  |  |  |  |  |  |  |  |  |  |  |  |  |  |  |  |  |  |  |  |  |  |  |  |  |  |  |  |  |  |  |  |  |  |  |  |  |  |  |  |  |
| Sep-14 | 5.7 |  |  |  |  |  |  |  |  |  |  |  |  |  |  |  |  |  |  |  |  |  |  |  |  |  |  |  |  |  |  |  |  |  |  |  |  |  |  |  |  |  |  |  |  |  |  |  |  |  |  |
| Oct-14 | 5.5 |  |  |  |  |  |  |  |  |  |  |  |  |  |  |  |  |  |  |  |  |  |  |  |  |  |  |  |  |  |  |  |  |  |  |  |  |  |  |  |  |  |  |  |  |  |  |  |  |  |  |
| Nov-14 | 5.5 |  |  |  |  |  |  |  |  |  |  |  |  |  |  |  |  |  |  |  |  |  |  |  |  |  |  |  |  |  |  |  |  |  |  |  |  |  |  |  |  |  |  |  |  |  |  |  |  |  |  |
| Dec-14 | 5.4 |  |  |  |  |  |  |  |  |  |  |  |  |  |  |  |  |  |  |  |  |  |  |  |  |  |  |  |  |  |  |  |  |  |  |  |  |  |  |  |  |  |  |  |  |  |  |  |  |  |  |
| Jan-15 | 6.1 |  |  |  |  |  |  |  |  |  |  |  |  |  |  |  |  |  |  |  |  |  |  |  |  |  |  |  |  |  |  |  |  |  |  |  |  |  |  |  |  |  |  |  |  |  |  |  |  |  |  |
| Feb-15 | 5.8 |  |  |  |  |  |  |  |  |  |  |  |  |  |  |  |  |  |  |  |  |  |  |  |  |  |  |  |  |  |  |  |  |  |  |  |  |  |  |  |  |  |  |  |  |  |  |  |  |  |  |
| Mar-15 | 5.6 |  |  |  |  |  |  |  |  |  |  |  |  |  |  |  |  |  |  |  |  |  |  |  |  |  |  |  |  |  |  |  |  |  |  |  |  |  |  |  |  |  |  |  |  |  |  |  |  |  |  |
| Apr-15 | 5.1 |  |  |  |  |  |  |  |  |  |  |  |  |  |  |  |  |  |  |  |  |  |  |  |  |  |  |  |  |  |  |  |  |  |  |  |  |  |  |  |  |  |  |  |  |  |  |  |  |  |  |
| May-15 | 5.3 |  |  |  |  |  |  |  |  |  |  |  |  |  |  |  |  |  |  |  |  |  |  |  |  |  |  |  |  |  |  |  |  |  |  |  |  |  |  |  |  |  |  |  |  |  |  |  |  |  |  |
| Jun-15 | 5.5 |  |  |  |  |  |  |  |  |  |  |  |  |  |  |  |  |  |  |  |  |  |  |  |  |  |  |  |  |  |  |  |  |  |  |  |  |  |  |  |  |  |  |  |  |  |  |  |  |  |  |
| Jul-15 | 5.6 |  |  |  |  |  |  |  |  |  |  |  |  |  |  |  |  |  |  |  |  |  |  |  |  |  |  |  |  |  |  |  |  |  |  |  |  |  |  |  |  |  |  |  |  |  |  |  |  |  |  |
| Aug-15 | 5.2 |  |  |  |  |  |  |  |  |  |  |  |  |  |  |  |  |  |  |  |  |  |  |  |  |  |  |  |  |  |  |  |  |  |  |  |  |  |  |  |  |  |  |  |  |  |  |  |  |  |  |
| Sep-15 | 4.9 |  |  |  |  |  |  |  |  |  |  |  |  |  |  |  |  |  |  |  |  |  |  |  |  |  |  |  |  |  |  |  |  |  |  |  |  |  |  |  |  |  |  |  |  |  |  |  |  |  |  |
| Oct-15 | 4.8 |  |  |  |  |  |  |  |  |  |  |  |  |  |  |  |  |  |  |  |  |  |  |  |  |  |  |  |  |  |  |  |  |  |  |  |  |  |  |  |  |  |  |  |  |  |  |  |  |  |  |
| Nov-15 | 4.8 |  |  |  |  |  |  |  |  |  |  |  |  |  |  |  |  |  |  |  |  |  |  |  |  |  |  |  |  |  |  |  |  |  |  |  |  |  |  |  |  |  |  |  |  |  |  |  |  |  |  |
| Dec-15 | 4.8 |  |  |  |  |  |  |  |  |  |  |  |  |  |  |  |  |  |  |  |  |  |  |  |  |  |  |  |  |  |  |  |  |  |  |  |  |  |  |  |  |  |  |  |  |  |  |  |  |  |  |
| Jan-16 | 5.3 |  |  |  |  |  |  |  |  |  |  |  |  |  |  |  |  |  |  |  |  |  |  |  |  |  |  |  |  |  |  |  |  |  |  |  |  |  |  |  |  |  |  |  |  |  |  |  |  |  |  |
| Feb-16 | 5.2 |  |  |  |  |  |  |  |  |  |  |  |  |  |  |  |  |  |  |  |  |  |  |  |  |  |  |  |  |  |  |  |  |  |  |  |  |  |  |  |  |  |  |  |  |  |  |  |  |  |  |
| Mar-16 | 5.1 |  |  |  |  |  |  |  |  |  |  |  |  |  |  |  |  |  |  |  |  |  |  |  |  |  |  |  |  |  |  |  |  |  |  |  |  |  |  |  |  |  |  |  |  |  |  |  |  |  |  |
| Apr-16 | 4.7 |  |  |  |  |  |  |  |  |  |  |  |  |  |  |  |  |  |  |  |  |  |  |  |  |  |  |  |  |  |  |  |  |  |  |  |  |  |  |  |  |  |  |  |  |  |  |  |  |  |  |
| May-16 | 4.5 |  |  |  |  |  |  |  |  |  |  |  |  |  |  |  |  |  |  |  |  |  |  |  |  |  |  |  |  |  |  |  |  |  |  |  |  |  |  |  |  |  |  |  |  |  |  |  |  |  |  |
| Jun-16 | 5.1 |  |  |  |  |  |  |  |  |  |  |  |  |  |  |  |  |  |  |  |  |  |  |  |  |  |  |  |  |  |  |  |  |  |  |  |  |  |  |  |  |  |  |  |  |  |  |  |  |  |  |
| Jul-16 | 5.1 |  |  |  |  |  |  |  |  |  |  |  |  |  |  |  |  |  |  |  |  |  |  |  |  |  |  |  |  |  |  |  |  |  |  |  |  |  |  |  |  |  |  |  |  |  |  |  |  |  |  |
| Aug-16 | 5 |  |  |  |  |  |  |  |  |  |  |  |  |  |  |  |  |  |  |  |  |  |  |  |  |  |  |  |  |  |  |  |  |  |  |  |  |  |  |  |  |  |  |  |  |  |  |  |  |  |  |
| Sep-16 | 4.8 |  |  |  |  |  |  |  |  |  |  |  |  |  |  |  |  |  |  |  |  |  |  |  |  |  |  |  |  |  |  |  |  |  |  |  |  |  |  |  |  |  |  |  |  |  |  |  |  |  |  |
| Oct-16 | 4.7 |  |  |  |  |  |  |  |  |  |  |  |  |  |  |  |  |  |  |  |  |  |  |  |  |  |  |  |  |  |  |  |  |  |  |  |  |  |  |  |  |  |  |  |  |  |  |  |  |  |  |
| Nov-16 | 4.4 |  |  |  |  |  |  |  |  |  |  |  |  |  |  |  |  |  |  |  |  |  |  |  |  |  |  |  |  |  |  |  |  |  |  |  |  |  |  |  |  |  |  |  |  |  |  |  |  |  |  |
| Dec-16 | 4.5 |  |  |  |  |  |  |  |  |  |  |  |  |  |  |  |  |  |  |  |  |  |  |  |  |  |  |  |  |  |  |  |  |  |  |  |  |  |  |  |  |  |  |  |  |  |  |  |  |  |  |
| Jan-17 | 5.1 |  |  |  |  |  |  |  |  |  |  |  |  |  |  |  |  |  |  |  |  |  |  |  |  |  |  |  |  |  |  |  |  |  |  |  |  |  |  |  |  |  |  |  |  |  |  |  |  |  |  |
| Feb-17 | 4.9 |  |  |  |  |  |  |  |  |  |  |  |  |  |  |  |  |  |  |  |  |  |  |  |  |  |  |  |  |  |  |  |  |  |  |  |  |  |  |  |  |  |  |  |  |  |  |  |  |  |  |
| Mar-17 | 4.6 |  |  |  |  |  |  |  |  |  |  |  |  |  |  |  |  |  |  |  |  |  |  |  |  |  |  |  |  |  |  |  |  |  |  |  |  |  |  |  |  |  |  |  |  |  |  |  |  |  |  |
| Apr-17 | 4.1 |  |  |  |  |  |  |  |  |  |  |  |  |  |  |  |  |  |  |  |  |  |  |  |  |  |  |  |  |  |  |  |  |  |  |  |  |  |  |  |  |  |  |  |  |  |  |  |  |  |  |
| May-17 | 4.1 |  |  |  |  |  |  |  |  |  |  |  |  |  |  |  |  |  |  |  |  |  |  |  |  |  |  |  |  |  |  |  |  |  |  |  |  |  |  |  |  |  |  |  |  |  |  |  |  |  |  |
| Jun-17 | 4.5 |  |  |  |  |  |  |  |  |  |  |  |  |  |  |  |  |  |  |  |  |  |  |  |  |  |  |  |  |  |  |  |  |  |  |  |  |  |  |  |  |  |  |  |  |  |  |  |  |  |  |
| Jul-17 | 4.6 |  |  |  |  |  |  |  |  |  |  |  |  |  |  |  |  |  |  |  |  |  |  |  |  |  |  |  |  |  |  |  |  |  |  |  |  |  |  |  |  |  |  |  |  |  |  |  |  |  |  |
| Aug-17 | 4.5 |  |  |  |  |  |  |  |  |  |  |  |  |  |  |  |  |  |  |  |  |  |  |  |  |  |  |  |  |  |  |  |  |  |  |  |  |  |  |  |  |  |  |  |  |  |  |  |  |  |  |
| Sep-17 | 4.1 |  |  |  |  |  |  |  |  |  |  |  |  |  |  |  |  |  |  |  |  |  |  |  |  |  |  |  |  |  |  |  |  |  |  |  |  |  |  |  |  |  |  |  |  |  |  |  |  |  |  |
| Oct-17 | 3.9 |  |  |  |  |  |  |  |  |  |  |  |  |  |  |  |  |  |  |  |  |  |  |  |  |  |  |  |  |  |  |  |  |  |  |  |  |  |  |  |  |  |  |  |  |  |  |  |  |  |  |
| Nov-17 | 3.9 |  |  |  |  |  |  |  |  |  |  |  |  |  |  |  |  |  |  |  |  |  |  |  |  |  |  |  |  |  |  |  |  |  |  |  |  |  |  |  |  |  |  |  |  |  |  |  |  |  |  |
| Dec-17 | 3.9 |  |  |  |  |  |  |  |  |  |  |  |  |  |  |  |  |  |  |  |  |  |  |  |  |  |  |  |  |  |  |  |  |  |  |  |  |  |  |  |  |  |  |  |  |  |  |  |  |  |  |
| Jan-18 | 4.5 |  |  |  |  |  |  |  |  |  |  |  |  |  |  |  |  |  |  |  |  |  |  |  |  |  |  |  |  |  |  |  |  |  |  |  |  |  |  |  |  |  |  |  |  |  |  |  |  |  |  |
| Feb-18 | 4.4 |  |  |  |  |  |  |  |  |  |  |  |  |  |  |  |  |  |  |  |  |  |  |  |  |  |  |  |  |  |  |  |  |  |  |  |  |  |  |  |  |  |  |  |  |  |  |  |  |  |  |
| Mar-18 | 4.1 |  |  |  |  |  |  |  |  |  |  |  |  |  |  |  |  |  |  |  |  |  |  |  |  |  |  |  |  |  |  |  |  |  |  |  |  |  |  |  |  |  |  |  |  |  |  |  |  |  |  |
| Apr-18 | 3.7 |  |  |  |  |  |  |  |  |  |  |  |  |  |  |  |  |  |  |  |  |  |  |  |  |  |  |  |  |  |  |  |  |  |  |  |  |  |  |  |  |  |  |  |  |  |  |  |  |  |  |
| May-18 | 3.6 |  |  |  |  |  |  |  |  |  |  |  |  |  |  |  |  |  |  |  |  |  |  |  |  |  |  |  |  |  |  |  |  |  |  |  |  |  |  |  |  |  |  |  |  |  |  |  |  |  |  |
| Jun-18 | 4.2 |  |  |  |  |  |  |  |  |  |  |  |  |  |  |  |  |  |  |  |  |  |  |  |  |  |  |  |  |  |  |  |  |  |  |  |  |  |  |  |  |  |  |  |  |  |  |  |  |  |  |
| Jul-18 | 4.1 |  |  |  |  |  |  |  |  |  |  |  |  |  |  |  |  |  |  |  |  |  |  |  |  |  |  |  |  |  |  |  |  |  |  |  |  |  |  |  |  |  |  |  |  |  |  |  |  |  |  |
| Aug-18 | 3.9 |  |  |  |  |  |  |  |  |  |  |  |  |  |  |  |  |  |  |  |  |  |  |  |  |  |  |  |  |  |  |  |  |  |  |  |  |  |  |  |  |  |  |  |  |  |  |  |  |  |  |
| Sep-18 | 3.6 |  |  |  |  |  |  |  |  |  |  |  |  |  |  |  |  |  |  |  |  |  |  |  |  |  |  |  |  |  |  |  |  |  |  |  |  |  |  |  |  |  |  |  |  |  |  |  |  |  |  |
| Oct-18 | 3.5 |  |  |  |  |  |  |  |  |  |  |  |  |  |  |  |  |  |  |  |  |  |  |  |  |  |  |  |  |  |  |  |  |  |  |  |  |  |  |  |  |  |  |  |  |  |  |  |  |  |  |
| Nov-18 | 3.5 |  |  |  |  |  |  |  |  |  |  |  |  |  |  |  |  |  |  |  |  |  |  |  |  |  |  |  |  |  |  |  |  |  |  |  |  |  |  |  |  |  |  |  |  |  |  |  |  |  |  |
| Dec-18 | 3.7 |  |  |  |  |  |  |  |  |  |  |  |  |  |  |  |  |  |  |  |  |  |  |  |  |  |  |  |  |  |  |  |  |  |  |  |  |  |  |  |  |  |  |  |  |  |  |  |  |  |  |
| Jan-19 | 4.4 |  |  |  |  |  |  |  |  |  |  |  |  |  |  |  |  |  |  |  |  |  |  |  |  |  |  |  |  |  |  |  |  |  |  |  |  |  |  |  |  |  |  |  |  |  |  |  |  |  |  |
| Feb-19 | 4.1 |  |  |  |  |  |  |  |  |  |  |  |  |  |  |  |  |  |  |  |  |  |  |  |  |  |  |  |  |  |  |  |  |  |  |  |  |  |  |  |  |  |  |  |  |  |  |  |  |  |  |
| Mar-19 | 3.9 |  |  |  |  |  |  |  |  |  |  |  |  |  |  |  |  |  |  |  |  |  |  |  |  |  |  |  |  |  |  |  |  |  |  |  |  |  |  |  |  |  |  |  |  |  |  |  |  |  |  |
| Apr-19 | 3.3 |  |  |  |  |  |  |  |  |  |  |  |  |  |  |  |  |  |  |  |  |  |  |  |  |  |  |  |  |  |  |  |  |  |  |  |  |  |  |  |  |  |  |  |  |  |  |  |  |  |  |
| May-19 | 3.4 |  |  |  |  |  |  |  |  |  |  |  |  |  |  |  |  |  |  |  |  |  |  |  |  |  |  |  |  |  |  |  |  |  |  |  |  |  |  |  |  |  |  |  |  |  |  |  |  |  |  |
| Jun-19 | 3.8 |  |  |  |  |  |  |  |  |  |  |  |  |  |  |  |  |  |  |  |  |  |  |  |  |  |  |  |  |  |  |  |  |  |  |  |  |  |  |  |  |  |  |  |  |  |  |  |  |  |  |
| Jul-19 | 4 |  |  |  |  |  |  |  |  |  |  |  |  |  |  |  |  |  |  |  |  |  |  |  |  |  |  |  |  |  |  |  |  |  |  |  |  |  |  |  |  |  |  |  |  |  |  |  |  |  |  |
| Aug-19 | 3.8 |  |  |  |  |  |  |  |  |  |  |  |  |  |  |  |  |  |  |  |  |  |  |  |  |  |  |  |  |  |  |  |  |  |  |  |  |  |  |  |  |  |  |  |  |  |  |  |  |  |  |
| Sep-19 | 3.3 |  |  |  |  |  |  |  |  |  |  |  |  |  |  |  |  |  |  |  |  |  |  |  |  |  |  |  |  |  |  |  |  |  |  |  |  |  |  |  |  |  |  |  |  |  |  |  |  |  |  |
| Oct-19 | 3.3 |  |  |  |  |  |  |  |  |  |  |  |  |  |  |  |  |  |  |  |  |  |  |  |  |  |  |  |  |  |  |  |  |  |  |  |  |  |  |  |  |  |  |  |  |  |  |  |  |  |  |
| Nov-19 | 3.3 |  |  |  |  |  |  |  |  |  |  |  |  |  |  |  |  |  |  |  |  |  |  |  |  |  |  |  |  |  |  |  |  |  |  |  |  |  |  |  |  |  |  |  |  |  |  |  |  |  |  |
| Dec-19 | 3.4 |  |  |  |  |  |  |  |  |  |  |  |  |  |  |  |  |  |  |  |  |  |  |  |  |  |  |  |  |  |  |  |  |  |  |  |  |  |  |  |  |  |  |  |  |  |  |  |  |  |  |
| Jan-20 | 4 |  |  |  |  |  |  |  |  |  |  |  |  |  |  |  |  |  |  |  |  |  |  |  |  |  |  |  |  |  |  |  |  |  |  |  |  |  |  |  |  |  |  |  |  |  |  |  |  |  |  |
| Feb-20 | 3.8 |  |  |  |  |  |  |  |  |  |  |  |  |  |  |  |  |  |  |  |  |  |  |  |  |  |  |  |  |  |  |  |  |  |  |  |  |  |  |  |  |  |  |  |  |  |  |  |  |  |  |
| Mar-20 | 4.5 |  |  |  |  |  |  |  |  |  |  |  |  |  |  |  |  |  |  |  |  |  |  |  |  |  |  |  |  |  |  |  |  |  |  |  |  |  |  |  |  |  |  |  |  |  |  |  |  |  |  |
| Apr-20 | 14.4 |  |  |  |  |  |  |  |  |  |  |  |  |  |  |  |  |  |  |  |  |  |  |  |  |  |  |  |  |  |  |  |  |  |  |  |  |  |  |  |  |  |  |  |  |  |  |  |  |  |  |
| May-20 | 13 |  |  |  |  |  |  |  |  |  |  |  |  |  |  |  |  |  |  |  |  |  |  |  |  |  |  |  |  |  |  |  |  |  |  |  |  |  |  |  |  |  |  |  |  |  |  |  |  |  |  |
| Jun-20 | 11.2 |  |  |  |  |  |  |  |  |  |  |  |  |  |  |  |  |  |  |  |  |  |  |  |  |  |  |  |  |  |  |  |  |  |  |  |  |  |  |  |  |  |  |  |  |  |  |  |  |  |  |
| Jul-20 | 10.5 |  |  |  |  |  |  |  |  |  |  |  |  |  |  |  |  |  |  |  |  |  |  |  |  |  |  |  |  |  |  |  |  |  |  |  |  |  |  |  |  |  |  |  |  |  |  |  |  |  |  |
| Aug-20 | 8.5 |  |  |  |  |  |  |  |  |  |  |  |  |  |  |  |  |  |  |  |  |  |  |  |  |  |  |  |  |  |  |  |  |  |  |  |  |  |  |  |  |  |  |  |  |  |  |  |  |  |  |
| Sep-20 | 7.7 |  |  |  |  |  |  |  |  |  |  |  |  |  |  |  |  |  |  |  |  |  |  |  |  |  |  |  |  |  |  |  |  |  |  |  |  |  |  |  |  |  |  |  |  |  |  |  |  |  |  |
| Oct-20 | 6.6 |  |  |  |  |  |  |  |  |  |  |  |  |  |  |  |  |  |  |  |  |  |  |  |  |  |  |  |  |  |  |  |  |  |  |  |  |  |  |  |  |  |  |  |  |  |  |  |  |  |  |
| Nov-20 | 6.4 |  |  |  |  |  |  |  |  |  |  |  |  |  |  |  |  |  |  |  |  |  |  |  |  |  |  |  |  |  |  |  |  |  |  |  |  |  |  |  |  |  |  |  |  |  |  |  |  |  |  |
| Dec-20 | 6.5 |  |  |  |  |  |  |  |  |  |  |  |  |  |  |  |  |  |  |  |  |  |  |  |  |  |  |  |  |  |  |  |  |  |  |  |  |  |  |  |  |  |  |  |  |  |  |  |  |  |  |
| Jan-21 | 6.8 |  |  |  |  |  |  |  |  |  |  |  |  |  |  |  |  |  |  |  |  |  |  |  |  |  |  |  |  |  |  |  |  |  |  |  |  |  |  |  |  |  |  |  |  |  |  |  |  |  |  |
| Feb-21 | 6.6 |  |  |  |  |  |  |  |  |  |  |  |  |  |  |  |  |  |  |  |  |  |  |  |  |  |  |  |  |  |  |  |  |  |  |  |  |  |  |  |  |  |  |  |  |  |  |  |  |  |  |
| Mar-21 | 6.2 |  |  |  |  |  |  |  |  |  |  |  |  |  |  |  |  |  |  |  |  |  |  |  |  |  |  |  |  |  |  |  |  |  |  |  |  |  |  |  |  |  |  |  |  |  |  |  |  |  |  |
| Apr-21 | 5.7 |  |  |  |  |  |  |  |  |  |  |  |  |  |  |  |  |  |  |  |  |  |  |  |  |  |  |  |  |  |  |  |  |  |  |  |  |  |  |  |  |  |  |  |  |  |  |  |  |  |  |
| May-21 | 5.5 |  |  |  |  |  |  |  |  |  |  |  |  |  |  |  |  |  |  |  |  |  |  |  |  |  |  |  |  |  |  |  |  |  |  |  |  |  |  |  |  |  |  |  |  |  |  |  |  |  |  |
| Jun-21 | 6.1 |  |  |  |  |  |  |  |  |  |  |  |  |  |  |  |  |  |  |  |  |  |  |  |  |  |  |  |  |  |  |  |  |  |  |  |  |  |  |  |  |  |  |  |  |  |  |  |  |  |  |
| Jul-21 | 5.7 |  |  |  |  |  |  |  |  |  |  |  |  |  |  |  |  |  |  |  |  |  |  |  |  |  |  |  |  |  |  |  |  |  |  |  |  |  |  |  |  |  |  |  |  |  |  |  |  |  |  |
| Aug-21 | 5.3 |  |  |  |  |  |  |  |  |  |  |  |  |  |  |  |  |  |  |  |  |  |  |  |  |  |  |  |  |  |  |  |  |  |  |  |  |  |  |  |  |  |  |  |  |  |  |  |  |  |  |
| Sep-21 | 4.6 |  |  |  |  |  |  |  |  |  |  |  |  |  |  |  |  |  |  |  |  |  |  |  |  |  |  |  |  |  |  |  |  |  |  |  |  |  |  |  |  |  |  |  |  |  |  |  |  |  |  |
| Oct-21 | 4.3 |  |  |  |  |  |  |  |  |  |  |  |  |  |  |  |  |  |  |  |  |  |  |  |  |  |  |  |  |  |  |  |  |  |  |  |  |  |  |  |  |  |  |  |  |  |  |  |  |  |  |
| Nov-21 | 3.9 |  |  |  |  |  |  |  |  |  |  |  |  |  |  |  |  |  |  |  |  |  |  |  |  |  |  |  |  |  |  |  |  |  |  |  |  |  |  |  |  |  |  |  |  |  |  |  |  |  |  |
| Dec-21 | 3.7 |  |  |  |  |  |  |  |  |  |  |  |  |  |  |  |  |  |  |  |  |  |  |  |  |  |  |  |  |  |  |  |  |  |  |  |  |  |  |  |  |  |  |  |  |  |  |  |  |  |  |
| Jan-22 | 4.4 |  |  |  |  |  |  |  |  |  |  |  |  |  |  |  |  |  |  |  |  |  |  |  |  |  |  |  |  |  |  |  |  |  |  |  |  |  |  |  |  |  |  |  |  |  |  |  |  |  |  |
| Feb-22 | 4.1 |  |  |  |  |  |  |  |  |  |  |  |  |  |  |  |  |  |  |  |  |  |  |  |  |  |  |  |  |  |  |  |  |  |  |  |  |  |  |  |  |  |  |  |  |  |  |  |  |  |  |
| Mar-22 | 3.8 |  |  |  |  |  |  |  |  |  |  |  |  |  |  |  |  |  |  |  |  |  |  |  |  |  |  |  |  |  |  |  |  |  |  |  |  |  |  |  |  |  |  |  |  |  |  |  |  |  |  |
| Apr-22 | 3.3 |  |  |  |  |  |  |  |  |  |  |  |  |  |  |  |  |  |  |  |  |  |  |  |  |  |  |  |  |  |  |  |  |  |  |  |  |  |  |  |  |  |  |  |  |  |  |  |  |  |  |
| May-22 | 3.4 |  |  |  |  |  |  |  |  |  |  |  |  |  |  |  |  |  |  |  |  |  |  |  |  |  |  |  |  |  |  |  |  |  |  |  |  |  |  |  |  |  |  |  |  |  |  |  |  |  |  |
| Jun-22 | 3.8 |  |  |  |  |  |  |  |  |  |  |  |  |  |  |  |  |  |  |  |  |  |  |  |  |  |  |  |  |  |  |  |  |  |  |  |  |  |  |  |  |  |  |  |  |  |  |  |  |  |  |
| Jul-22 | 3.8 |  |  |  |  |  |  |  |  |  |  |  |  |  |  |  |  |  |  |  |  |  |  |  |  |  |  |  |  |  |  |  |  |  |  |  |  |  |  |  |  |  |  |  |  |  |  |  |  |  |  |
| Aug-22 | 3.8 |  |  |  |  |  |  |  |  |  |  |  |  |  |  |  |  |  |  |  |  |  |  |  |  |  |  |  |  |  |  |  |  |  |  |  |  |  |  |  |  |  |  |  |  |  |  |  |  |  |  |
| Sep-22 | 3.3 |  |  |  |  |  |  |  |  |  |  |  |  |  |  |  |  |  |  |  |  |  |  |  |  |  |  |  |  |  |  |  |  |  |  |  |  |  |  |  |  |  |  |  |  |  |  |  |  |  |  |
| Oct-22 | 3.4 |  |  |  |  |  |  |  |  |  |  |  |  |  |  |  |  |  |  |  |  |  |  |  |  |  |  |  |  |  |  |  |  |  |  |  |  |  |  |  |  |  |  |  |  |  |  |  |  |  |  |
| Nov-22 | 3.4 |  |  |  |  |  |  |  |  |  |  |  |  |  |  |  |  |  |  |  |  |  |  |  |  |  |  |  |  |  |  |  |  |  |  |  |  |  |  |  |  |  |  |  |  |  |  |  |  |  |  |
| Dec-22 | 3.3 |  |  |  |  |  |  |  |  |  |  |  |  |  |  |  |  |  |  |  |  |  |  |  |  |  |  |  |  |  |  |  |  |  |  |  |  |  |  |  |  |  |  |  |  |  |  |  |  |  |  |
| Jan-23 | 3.9 |  |  |  |  |  |  |  |  |  |  |  |  |  |  |  |  |  |  |  |  |  |  |  |  |  |  |  |  |  |  |  |  |  |  |  |  |  |  |  |  |  |  |  |  |  |  |  |  |  |  |
| Feb-23 | 3.9 |  |  |  |  |  |  |  |  |  |  |  |  |  |  |  |  |  |  |  |  |  |  |  |  |  |  |  |  |  |  |  |  |  |  |  |  |  |  |  |  |  |  |  |  |  |  |  |  |  |  |
| Mar-23 | 3.6 |  |  |  |  |  |  |  |  |  |  |  |  |  |  |  |  |  |  |  |  |  |  |  |  |  |  |  |  |  |  |  |  |  |  |  |  |  |  |  |  |  |  |  |  |  |  |  |  |  |  |
| Apr-23 | 3.1 |  |  |  |  |  |  |  |  |  |  |  |  |  |  |  |  |  |  |  |  |  |  |  |  |  |  |  |  |  |  |  |  |  |  |  |  |  |  |  |  |  |  |  |  |  |  |  |  |  |  |
| May-23 | 3.4 |  |  |  |  |  |  |  |  |  |  |  |  |  |  |  |  |  |  |  |  |  |  |  |  |  |  |  |  |  |  |  |  |  |  |  |  |  |  |  |  |  |  |  |  |  |  |  |  |  |  |
| Jun-23 | 3.8 |  |  |  |  |  |  |  |  |  |  |  |  |  |  |  |  |  |  |  |  |  |  |  |  |  |  |  |  |  |  |  |  |  |  |  |  |  |  |  |  |  |  |  |  |  |  |  |  |  |  |
| Jul-23 | 3.8 |  |  |  |  |  |  |  |  |  |  |  |  |  |  |  |  |  |  |  |  |  |  |  |  |  |  |  |  |  |  |  |  |  |  |  |  |  |  |  |  |  |  |  |  |  |  |  |  |  |  |
| Aug-23 | 3.9 |  |  |  |  |  |  |  |  |  |  |  |  |  |  |  |  |  |  |  |  |  |  |  |  |  |  |  |  |  |  |  |  |  |  |  |  |  |  |  |  |  |  |  |  |  |  |  |  |  |  |
| Sep-23 | 3.6 |  |  |  |  |  |  |  |  |  |  |  |  |  |  |  |  |  |  |  |  |  |  |  |  |  |  |  |  |  |  |  |  |  |  |  |  |  |  |  |  |  |  |  |  |  |  |  |  |  |  |
| Oct-23 | 3.6 |  |  |  |  |  |  |  |  |  |  |  |  |  |  |  |  |  |  |  |  |  |  |  |  |  |  |  |  |  |  |  |  |  |  |  |  |  |  |  |  |  |  |  |  |  |  |  |  |  |  |
| Nov-23 | 3.5 |  |  |  |  |  |  |  |  |  |  |  |  |  |  |  |  |  |  |  |  |  |  |  |  |  |  |  |  |  |  |  |  |  |  |  |  |  |  |  |  |  |  |  |  |  |  |  |  |  |  |
| Dec-23 | 3.5 |  |  |  |  |  |  |  |  |  |  |  |  |  |  |  |  |  |  |  |  |  |  |  |  |  |  |  |  |  |  |  |  |  |  |  |  |  |  |  |  |  |  |  |  |  |  |  |  |  |  |